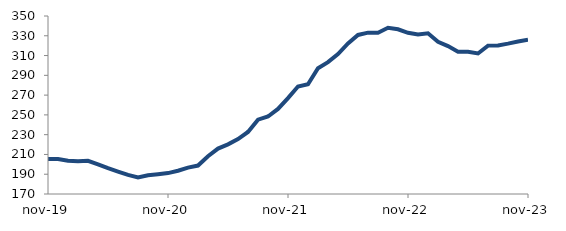
| Category | Series 0 |
|---|---|
| 2019-11-01 | 205.444 |
| 2019-12-01 | 205.45 |
| 2020-01-01 | 203.595 |
| 2020-02-01 | 202.996 |
| 2020-03-01 | 203.606 |
| 2020-04-01 | 199.997 |
| 2020-05-01 | 196.129 |
| 2020-06-01 | 192.644 |
| 2020-07-01 | 189.309 |
| 2020-08-01 | 186.635 |
| 2020-09-01 | 188.903 |
| 2020-10-01 | 189.967 |
| 2020-11-01 | 191.14 |
| 2020-12-01 | 193.522 |
| 2021-01-01 | 196.705 |
| 2021-02-01 | 198.76 |
| 2021-03-01 | 208.155 |
| 2021-04-01 | 215.916 |
| 2021-05-01 | 220.213 |
| 2021-06-01 | 225.532 |
| 2021-07-01 | 232.751 |
| 2021-08-01 | 245.217 |
| 2021-09-01 | 248.367 |
| 2021-10-01 | 256.011 |
| 2021-11-01 | 267.005 |
| 2021-12-01 | 278.738 |
| 2022-01-01 | 281.024 |
| 2022-02-01 | 297.23 |
| 2022-03-01 | 303.362 |
| 2022-04-01 | 311.514 |
| 2022-05-01 | 322.269 |
| 2022-06-01 | 330.847 |
| 2022-07-01 | 333.173 |
| 2022-08-01 | 333.056 |
| 2022-09-01 | 338.053 |
| 2022-10-01 | 336.541 |
| 2022-11-01 | 333.017 |
| 2022-12-01 | 331.349 |
| 2023-01-01 | 332.533 |
| 2023-02-01 | 323.969 |
| 2023-03-01 | 319.613 |
| 2023-04-01 | 313.925 |
| 2023-05-01 | 313.735 |
| 2023-06-01 | 312.115 |
| 2023-07-01 | 320.047 |
| 2023-08-01 | 320.242 |
| 2023-09-01 | 322.058 |
| 2023-10-01 | 324.205 |
| 2023-11-01 | 326.053 |